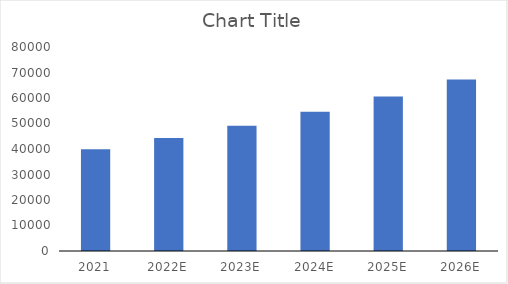
| Category | Series 0 |
|---|---|
| 2021 | 39900 |
| 2022E | 44289 |
| 2023E | 49160.79 |
| 2024E | 54568.477 |
| 2025E | 60571.009 |
| 2026E | 67233.82 |